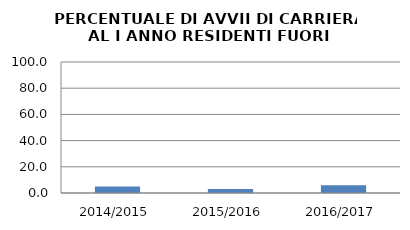
| Category | 2014/2015 2015/2016 2016/2017 |
|---|---|
| 2014/2015 | 4.918 |
| 2015/2016 | 2.979 |
| 2016/2017 | 5.907 |